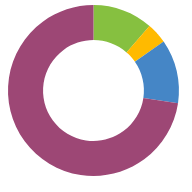
| Category | TURTAS |
|---|---|
| GRYNIEJI PINIGAI | 43300 |
| INVESTICIJOS | 15000 |
| IŠPIRKIMAS | 46000 |
| ASMENINIS | 276500 |